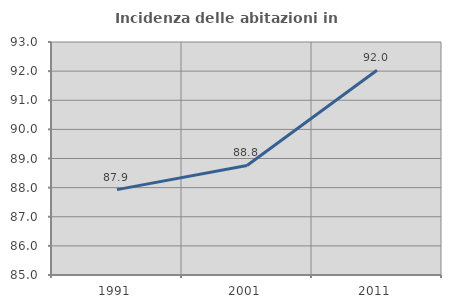
| Category | Incidenza delle abitazioni in proprietà  |
|---|---|
| 1991.0 | 87.931 |
| 2001.0 | 88.76 |
| 2011.0 | 92.029 |